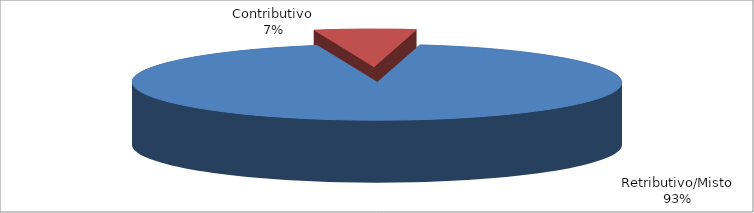
| Category | Series 1 |
|---|---|
| Retributivo/Misto | 87465 |
| Contributivo | 6293 |